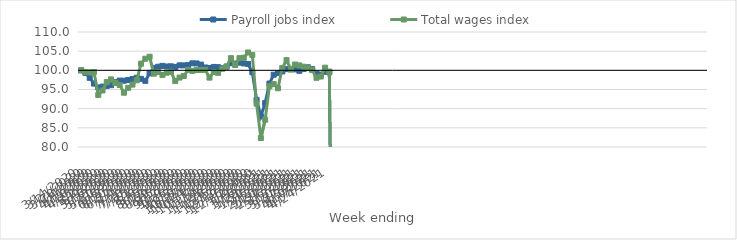
| Category | Payroll jobs index | Total wages index |
|---|---|---|
| 14/03/2020 | 100 | 100 |
| 21/03/2020 | 99.315 | 99.509 |
| 28/03/2020 | 98.046 | 99.477 |
| 04/04/2020 | 96.54 | 99.56 |
| 11/04/2020 | 95.536 | 93.564 |
| 18/04/2020 | 95.743 | 94.745 |
| 25/04/2020 | 95.936 | 96.932 |
| 02/05/2020 | 96.129 | 97.64 |
| 09/05/2020 | 96.908 | 96.705 |
| 16/05/2020 | 97.331 | 96.18 |
| 23/05/2020 | 97.299 | 94.163 |
| 30/05/2020 | 97.471 | 95.442 |
| 06/06/2020 | 97.75 | 96.28 |
| 13/06/2020 | 98.066 | 97.41 |
| 20/06/2020 | 97.778 | 101.743 |
| 27/06/2020 | 97.248 | 103.03 |
| 04/07/2020 | 99.205 | 103.543 |
| 11/07/2020 | 100.641 | 99.124 |
| 18/07/2020 | 100.943 | 99.553 |
| 25/07/2020 | 101.16 | 98.794 |
| 01/08/2020 | 101.006 | 99.384 |
| 08/08/2020 | 101.05 | 99.578 |
| 15/08/2020 | 100.884 | 97.208 |
| 22/08/2020 | 101.304 | 98.112 |
| 29/08/2020 | 101.279 | 98.526 |
| 05/09/2020 | 101.387 | 100.144 |
| 12/09/2020 | 101.826 | 99.865 |
| 19/09/2020 | 101.796 | 100.07 |
| 26/09/2020 | 101.5 | 100.11 |
| 03/10/2020 | 100.751 | 100.108 |
| 10/10/2020 | 100.61 | 98.098 |
| 17/10/2020 | 100.883 | 99.561 |
| 24/10/2020 | 100.829 | 99.344 |
| 31/10/2020 | 100.558 | 100.433 |
| 07/11/2020 | 100.953 | 101.013 |
| 14/11/2020 | 101.843 | 103.169 |
| 21/11/2020 | 101.78 | 101.39 |
| 28/11/2020 | 102.012 | 103.18 |
| 05/12/2020 | 101.801 | 103.302 |
| 12/12/2020 | 101.673 | 104.654 |
| 19/12/2020 | 99.505 | 104.024 |
| 26/12/2020 | 92.294 | 91.314 |
| 02/01/2021 | 88.007 | 82.33 |
| 09/01/2021 | 91.453 | 87.109 |
| 16/01/2021 | 96.558 | 95.845 |
| 23/01/2021 | 98.853 | 96.398 |
| 30/01/2021 | 99.267 | 95.327 |
| 06/02/2021 | 99.714 | 100.588 |
| 13/02/2021 | 100.306 | 102.654 |
| 20/02/2021 | 100.258 | 100.274 |
| 27/02/2021 | 100.252 | 101.516 |
| 06/03/2021 | 99.87 | 101.284 |
| 13/03/2021 | 100.364 | 100.94 |
| 20/03/2021 | 100.794 | 100.578 |
| 27/03/2021 | 100.308 | 100.064 |
| 03/04/2021 | 99.146 | 98.047 |
| 10/04/2021 | 98.888 | 98.38 |
| 17/04/2021 | 99.631 | 100.698 |
| 24/04/2021 | 99.512 | 99.682 |